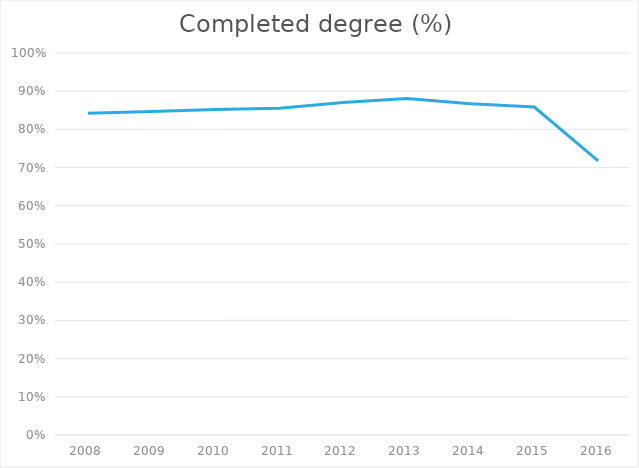
| Category | Percent completing degree |
|---|---|
| 2008.0 | 0.842 |
| 2009.0 | 0.847 |
| 2010.0 | 0.852 |
| 2011.0 | 0.856 |
| 2012.0 | 0.87 |
| 2013.0 | 0.881 |
| 2014.0 | 0.867 |
| 2015.0 | 0.859 |
| 2016.0 | 0.718 |